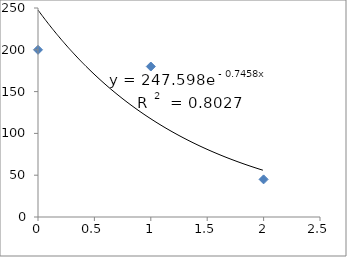
| Category | Series 0 |
|---|---|
| 0.0 | 200 |
| 1.0 | 180 |
| 2.0 | 45 |